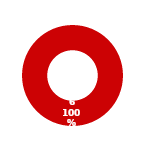
| Category | ACCESS |
|---|---|
| MIL 3 Complete | 0 |
| MIL 3 Not Complete | 6 |